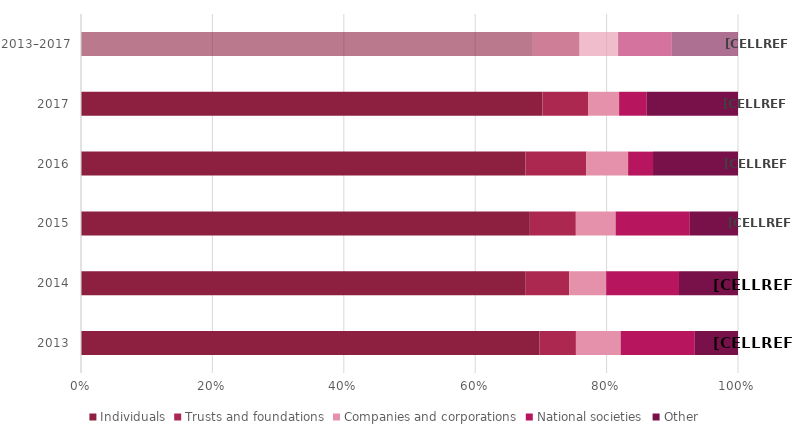
| Category | Individuals | Trusts and foundations | Companies and corporations | National societies | Other |
|---|---|---|---|---|---|
| 2013 | 0.698 | 0.055 | 0.068 | 0.113 | 0.066 |
| 2014 | 0.676 | 0.067 | 0.056 | 0.111 | 0.09 |
| 2015 | 0.683 | 0.07 | 0.061 | 0.113 | 0.073 |
| 2016 | 0.677 | 0.093 | 0.063 | 0.038 | 0.129 |
| 2017 | 0.702 | 0.069 | 0.047 | 0.042 | 0.139 |
| 2013–2017 | 0.688 | 0.071 | 0.059 | 0.082 | 0.101 |